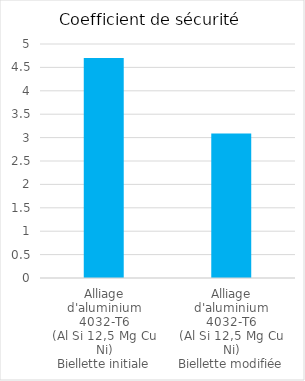
| Category | Alliage
d'aluminium
4032-T6
(Al Si 12,5 Mg Cu Ni)
Biellette initiale |
|---|---|
| Alliage
d'aluminium
4032-T6
(Al Si 12,5 Mg Cu Ni)
Biellette initiale | 4.701 |
| Alliage
d'aluminium
4032-T6
(Al Si 12,5 Mg Cu Ni)
Biellette modifiée | 3.088 |